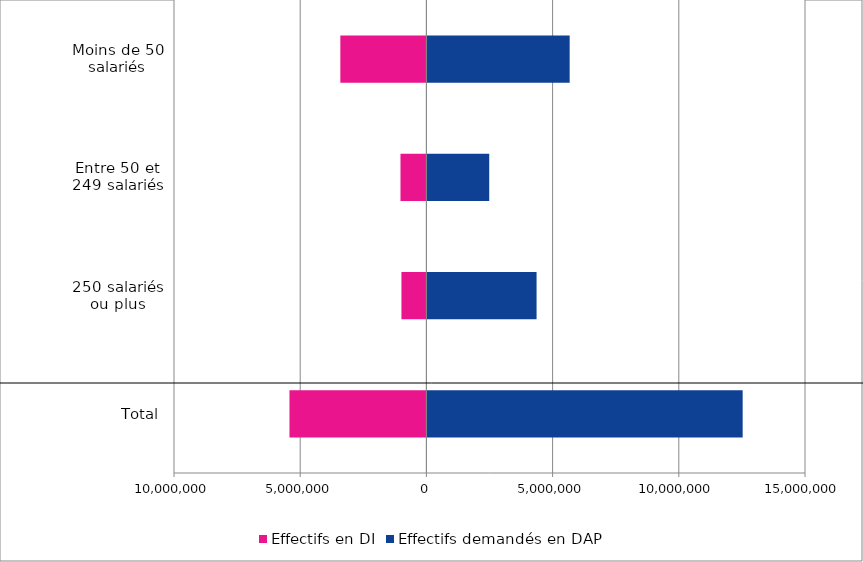
| Category | Effectifs en DI | Effectifs demandés en DAP |
|---|---|---|
| Total | -5425506 | 12530465 |
| 250 salariés ou plus | -988712 | 4364915 |
| Entre 50 et 249 salariés | -1027065 | 2489210 |
| Moins de 50 salariés | -3409729 | 5676340 |